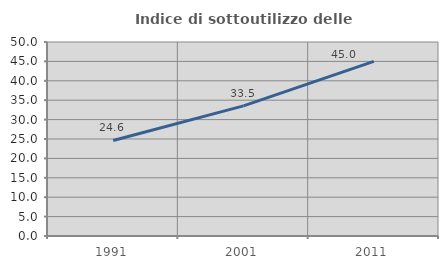
| Category | Indice di sottoutilizzo delle abitazioni  |
|---|---|
| 1991.0 | 24.614 |
| 2001.0 | 33.525 |
| 2011.0 | 45.016 |